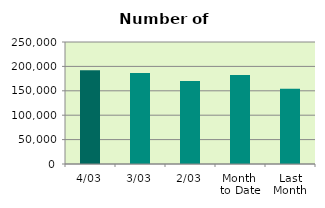
| Category | Series 0 |
|---|---|
| 4/03 | 192250 |
| 3/03 | 186696 |
| 2/03 | 170064 |
| Month 
to Date | 182375.5 |
| Last
Month | 154356.5 |